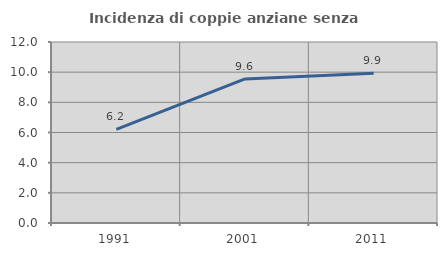
| Category | Incidenza di coppie anziane senza figli  |
|---|---|
| 1991.0 | 6.207 |
| 2001.0 | 9.554 |
| 2011.0 | 9.934 |